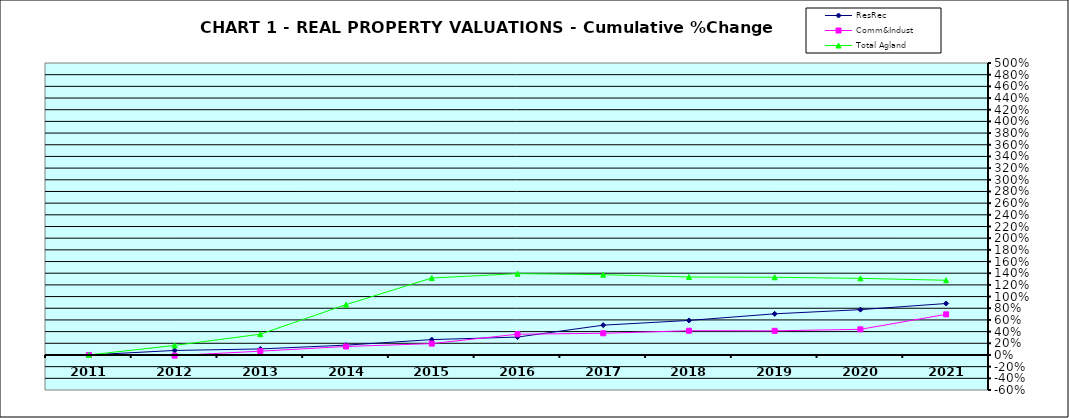
| Category | ResRec | Comm&Indust | Total Agland |
|---|---|---|---|
| 2011.0 | 0 | 0 | 0 |
| 2012.0 | 0.077 | -0.012 | 0.163 |
| 2013.0 | 0.103 | 0.065 | 0.356 |
| 2014.0 | 0.168 | 0.145 | 0.862 |
| 2015.0 | 0.263 | 0.194 | 1.318 |
| 2016.0 | 0.306 | 0.356 | 1.393 |
| 2017.0 | 0.51 | 0.371 | 1.375 |
| 2018.0 | 0.591 | 0.415 | 1.335 |
| 2019.0 | 0.705 | 0.413 | 1.33 |
| 2020.0 | 0.776 | 0.439 | 1.312 |
| 2021.0 | 0.881 | 0.696 | 1.279 |